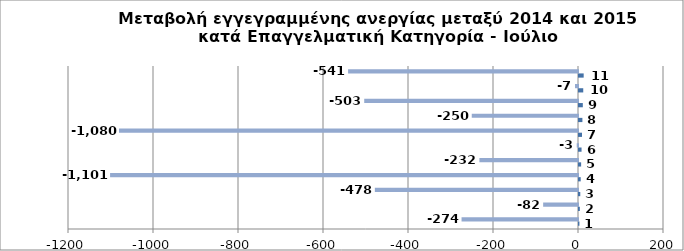
| Category | Series 0 | Series 1 |
|---|---|---|
| 0 | 1 | -274 |
| 1 | 2 | -82 |
| 2 | 3 | -478 |
| 3 | 4 | -1101 |
| 4 | 5 | -232 |
| 5 | 6 | -3 |
| 6 | 7 | -1080 |
| 7 | 8 | -250 |
| 8 | 9 | -503 |
| 9 | 10 | -7 |
| 10 | 11 | -541 |